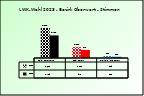
| Category | 2018 | 2023 |
|---|---|---|
| Bgld. Bauernbund | 3635 | 2739 |
| SPÖ Bauern | 1321 | 978 |
| Freiheitliche Bauern | 229 | 152 |